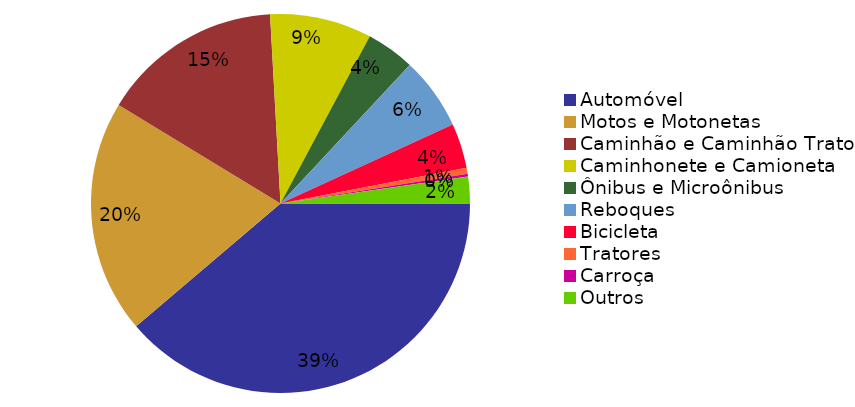
| Category | Qtde Veículos |
|---|---|
| Automóvel | 1004 |
| Motos e Motonetas | 516 |
| Caminhão e Caminhão Trator | 399 |
| Caminhonete e Camioneta | 225 |
| Ônibus e Microônibus | 107 |
| Reboques | 161 |
| Bicicleta | 99 |
| Tratores | 13 |
| Carroça | 6 |
| Outros | 59 |